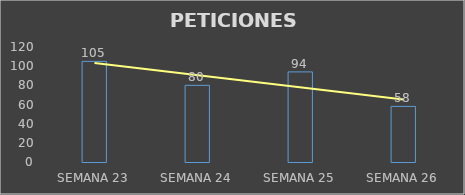
| Category | Series 0 |
|---|---|
| SEMANA 23 | 105 |
| SEMANA 24 | 80 |
| SEMANA 25 | 94 |
| SEMANA 26 | 58 |